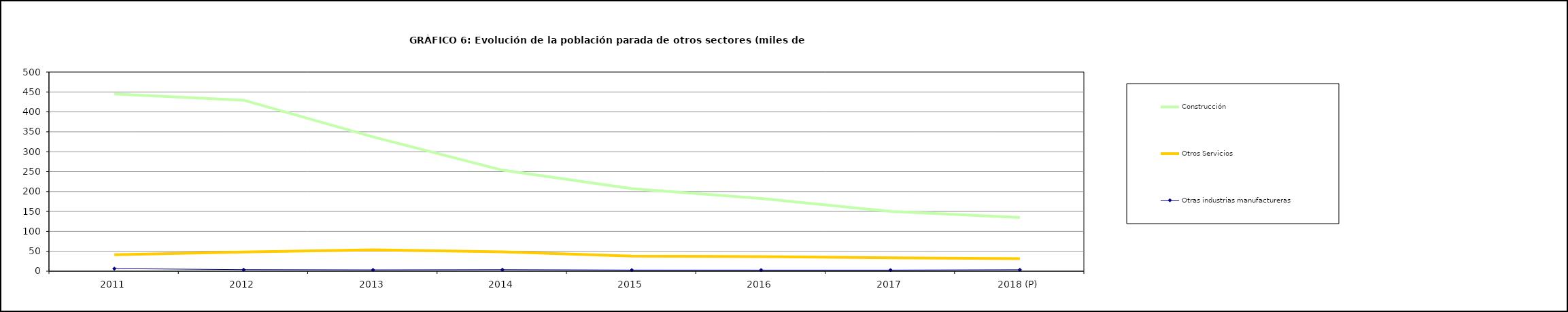
| Category | Construcción | Otros Servicios | Otras industrias manufactureras |
|---|---|---|---|
| 2011 | 445 | 41.375 | 6.55 |
| 2012 | 429.35 | 48.3 | 3.85 |
| 2013 | 337.3 | 53.6 | 3.3 |
| 2014 | 253.7 | 48.725 | 3.775 |
| 2015 | 207.3 | 38 | 2.9 |
| 2016 | 182.7 | 36.7 | 2.8 |
| 2017 | 150.3 | 33.7 | 2.8 |
| 2018 (P) | 134.825 | 31.575 | 3.6 |